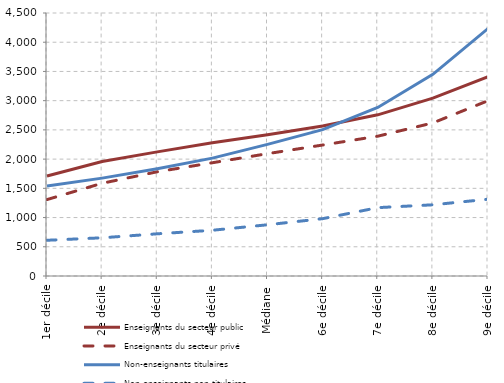
| Category | Enseignants du secteur public | Enseignants du secteur privé | Non-enseignants titulaires | Non-enseignants non titulaires |
|---|---|---|---|---|
| 1er décile | 1711.917 | 1307.643 | 1539.5 | 611.212 |
| 2e décile | 1959.583 | 1586.667 | 1674.919 | 653.771 |
| 3e décile | 2123.5 | 1783.167 | 1835.833 | 721.917 |
| 4e décile | 2278.917 | 1937.651 | 2016.75 | 782.662 |
| Médiane | 2417.667 | 2092.996 | 2252.167 | 876.463 |
| 6e décile | 2565.083 | 2241 | 2504.667 | 980.917 |
| 7e décile | 2757.75 | 2391.917 | 2882.917 | 1169.57 |
| 8e décile | 3044.045 | 2619.25 | 3450.417 | 1218.169 |
| 9e décile | 3408.917 | 2999.083 | 4233.5 | 1313.818 |